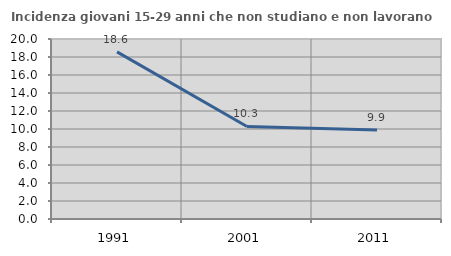
| Category | Incidenza giovani 15-29 anni che non studiano e non lavorano  |
|---|---|
| 1991.0 | 18.571 |
| 2001.0 | 10.28 |
| 2011.0 | 9.886 |